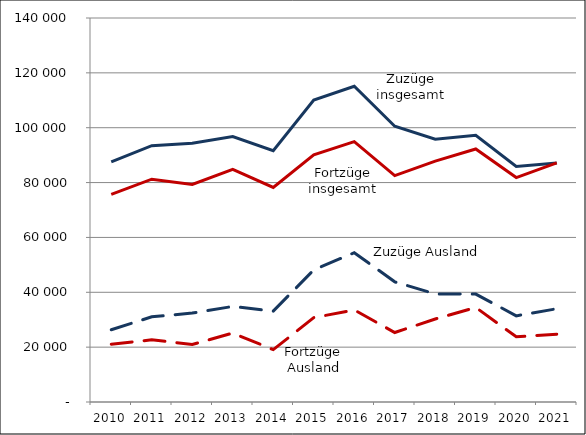
| Category | Zuzüge insgesamt | Zuzüge Ausland | Fortzüge insgesamt | Fortzüge Ausland |
|---|---|---|---|---|
| 2010.0 | 87538 | 26324 | 75668 | 21078 |
| 2011.0 | 93466 | 31048 | 81231 | 22674 |
| 2012.0 | 94346 | 32412 | 79335 | 20979 |
| 2013.0 | 96782 | 34839 | 84823 | 25125 |
| 2014.0 | 91594 | 33131 | 78218 | 19091 |
| 2015.0 | 110070 | 48173 | 90072 | 30757 |
| 2016.0 | 115115 | 54438 | 94914 | 33587 |
| 2017.0 | 100534 | 43809 | 82525 | 25341 |
| 2018.0 | 95790 | 39392 | 87811 | 30263 |
| 2019.0 | 97239 | 39348 | 92236 | 34484 |
| 2020.0 | 85885 | 31407 | 81828 | 23767 |
| 2021.0 | 87108 | 33996 | 87178 | 24741 |